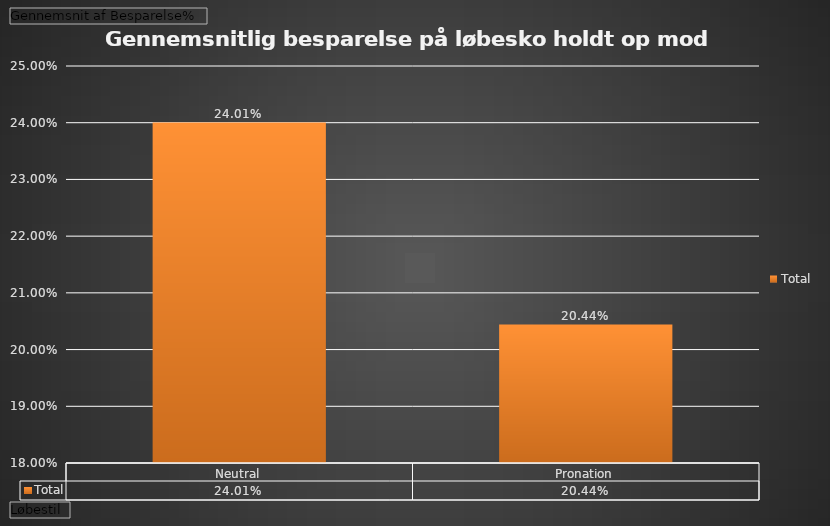
| Category | Total |
|---|---|
| Neutral | 0.24 |
| Pronation | 0.204 |